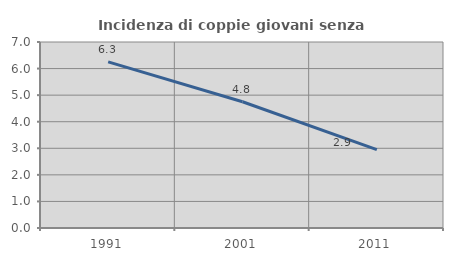
| Category | Incidenza di coppie giovani senza figli |
|---|---|
| 1991.0 | 6.253 |
| 2001.0 | 4.751 |
| 2011.0 | 2.95 |